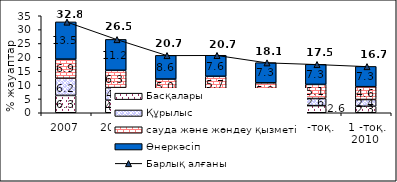
| Category | Басқалары | Құрылыс | сауда және жөндеу қызметі  | Өнеркәсіп |
|---|---|---|---|---|
| 2007 | 6.255 | 6.2 | 6.882 | 13.452 |
| 2008 | 4.53 | 4.538 | 6.25 | 11.157 |
| 1 -тоқ. 2009 | 3.316 | 3.839 | 5.003 | 8.551 |
| 2 -тоқ.  | 4.073 | 3.412 | 5.669 | 7.595 |
| 3 -тоқ. | 2.621 | 2.987 | 5.189 | 7.285 |
| 4 -тоқ. | 2.568 | 2.568 | 5.086 | 7.251 |
| 1 -тоқ. 2010  | 2.339 | 2.439 | 4.629 | 7.317 |